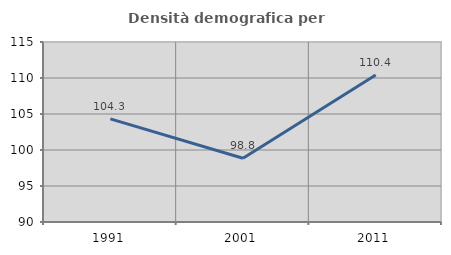
| Category | Densità demografica |
|---|---|
| 1991.0 | 104.328 |
| 2001.0 | 98.847 |
| 2011.0 | 110.425 |